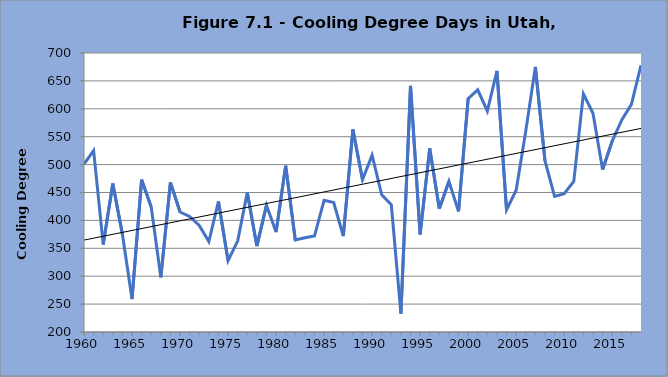
| Category | Series 0 |
|---|---|
| 1960.0 | 501 |
| 1961.0 | 525 |
| 1962.0 | 357 |
| 1963.0 | 466 |
| 1964.0 | 375 |
| 1965.0 | 259 |
| 1966.0 | 473 |
| 1967.0 | 424 |
| 1968.0 | 298 |
| 1969.0 | 468 |
| 1970.0 | 415 |
| 1971.0 | 407 |
| 1972.0 | 391 |
| 1973.0 | 362 |
| 1974.0 | 434 |
| 1975.0 | 328 |
| 1976.0 | 363 |
| 1977.0 | 450 |
| 1978.0 | 354 |
| 1979.0 | 427 |
| 1980.0 | 379 |
| 1981.0 | 498 |
| 1982.0 | 365 |
| 1983.0 | 369 |
| 1984.0 | 372 |
| 1985.0 | 436 |
| 1986.0 | 432 |
| 1987.0 | 372 |
| 1988.0 | 563 |
| 1989.0 | 473 |
| 1990.0 | 517 |
| 1991.0 | 446 |
| 1992.0 | 428 |
| 1993.0 | 233 |
| 1994.0 | 641 |
| 1995.0 | 375 |
| 1996.0 | 529 |
| 1997.0 | 421 |
| 1998.0 | 470 |
| 1999.0 | 416 |
| 2000.0 | 618 |
| 2001.0 | 634 |
| 2002.0 | 596 |
| 2003.0 | 668 |
| 2004.0 | 419 |
| 2005.0 | 454 |
| 2006.0 | 560 |
| 2007.0 | 675 |
| 2008.0 | 507 |
| 2009.0 | 443 |
| 2010.0 | 448 |
| 2011.0 | 470 |
| 2012.0 | 627 |
| 2013.0 | 592 |
| 2014.0 | 491 |
| 2015.0 | 542 |
| 2016.0 | 580 |
| 2017.0 | 608 |
| 2018.0 | 678 |